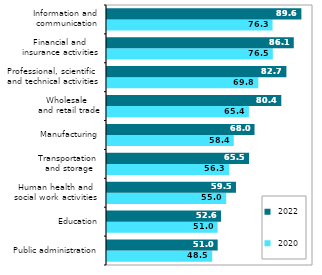
| Category |  2020 |  2022 |
|---|---|---|
| Public administration | 48.516 | 51.04 |
| Education | 50.999 | 52.567 |
| Human health and
 social work activities  | 54.968 | 59.473 |
| Transportation
 and storage | 56.268 | 65.51 |
| Manufacturing | 58.447 | 68.028 |
| Wholesale
 and retail trade | 65.435 | 80.375 |
| Professional, scientific
 and technical activities | 69.778 | 82.735 |
| Financial and
 insurance activities | 76.476 | 86.134 |
| Information and
 communication | 76.344 | 89.641 |